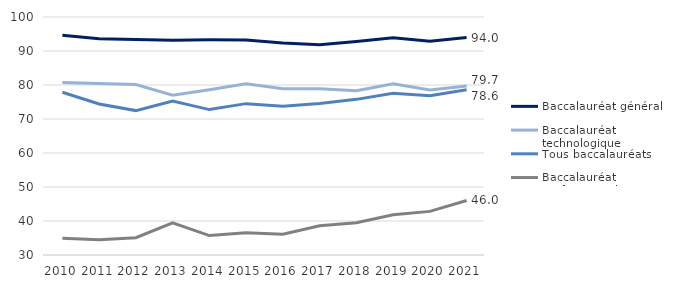
| Category | Baccalauréat général | Baccalauréat technologique | Tous baccalauréats | Baccalauréat professionnel |
|---|---|---|---|---|
| 2010 | 94.642 | 80.729 | 77.87 | 34.944 |
| 2011 | 93.616 | 80.412 | 74.418 | 34.497 |
| 2012 | 93.405 | 80.146 | 72.473 | 35.099 |
| 2013 | 93.19 | 76.988 | 75.294 | 39.476 |
| 2014 | 93.327 | 78.627 | 72.768 | 35.719 |
| 2015 | 93.261 | 80.343 | 74.519 | 36.511 |
| 2016 | 92.327 | 78.905 | 73.786 | 36.126 |
| 2017 | 91.827 | 78.866 | 74.585 | 38.6 |
| 2018 | 92.759 | 78.292 | 75.777 | 39.463 |
| 2019 | 93.862 | 80.356 | 77.598 | 41.819 |
| 2020 | 92.882 | 78.546 | 76.875 | 42.827 |
| 2021 | 93.969 | 79.685 | 78.585 | 46.032 |